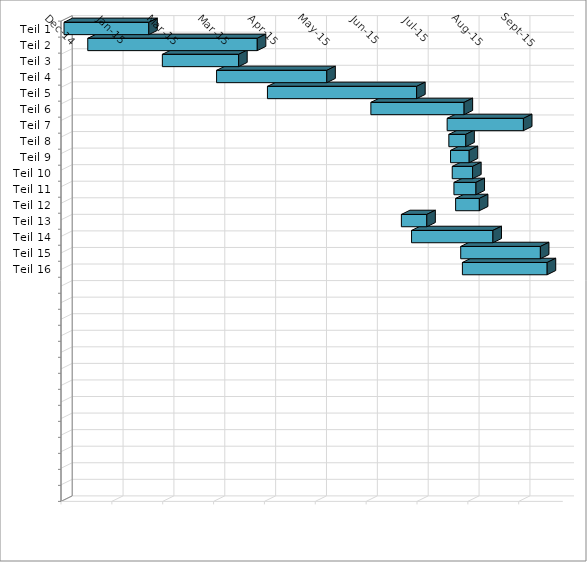
| Category | Beginn | Ende |
|---|---|---|
| Teil 1 | 1/1/15 | 50 |
| Teil 2 | 1/15/15 | 100 |
| Teil 3 | 2/28/15 | 45 |
| Teil 4 | 4/1/15 | 65 |
| Teil 5 | 5/1/15 | 88 |
| Teil 6 | 7/1/15 | 55 |
| Teil 7 | 8/15/15 | 45 |
| Teil 8 | 8/16/15 | 10 |
| Teil 9 | 8/17/15 | 11 |
| Teil 10 | 8/18/15 | 12 |
| Teil 11 | 8/19/15 | 13 |
| Teil 12 | 8/20/15 | 14 |
| Teil 13 | 7/19/15 | 15 |
| Teil 14 | 7/25/15 | 48 |
| Teil 15 | 8/23/15 | 47 |
| Teil 16 | 8/24/15 | 50 |